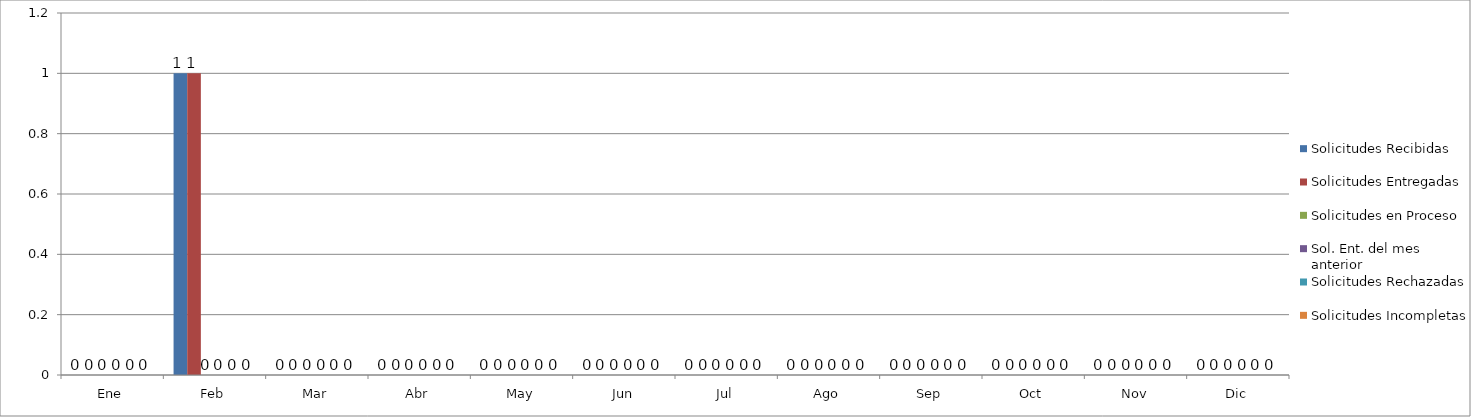
| Category | Solicitudes Recibidas  | Solicitudes Entregadas | Solicitudes en Proceso | Sol. Ent. del mes anterior | Solicitudes Rechazadas | Solicitudes Incompletas |
|---|---|---|---|---|---|---|
| Ene | 0 | 0 | 0 | 0 | 0 | 0 |
| Feb | 1 | 1 | 0 | 0 | 0 | 0 |
| Mar | 0 | 0 | 0 | 0 | 0 | 0 |
| Abr | 0 | 0 | 0 | 0 | 0 | 0 |
| May | 0 | 0 | 0 | 0 | 0 | 0 |
| Jun | 0 | 0 | 0 | 0 | 0 | 0 |
| Jul | 0 | 0 | 0 | 0 | 0 | 0 |
| Ago | 0 | 0 | 0 | 0 | 0 | 0 |
| Sep | 0 | 0 | 0 | 0 | 0 | 0 |
| Oct | 0 | 0 | 0 | 0 | 0 | 0 |
| Nov | 0 | 0 | 0 | 0 | 0 | 0 |
| Dic | 0 | 0 | 0 | 0 | 0 | 0 |